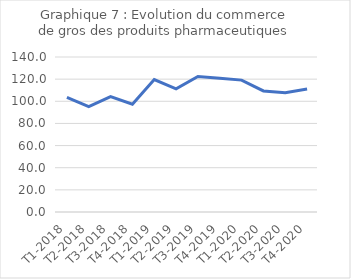
| Category | Series 0 |
|---|---|
| T1-2018 | 103.426 |
| T2-2018 | 95.112 |
| T3-2018 | 104.207 |
| T4-2018 | 97.33 |
| T1-2019 | 119.664 |
| T2-2019 | 111.175 |
| T3-2019 | 122.349 |
| T4-2019 | 120.712 |
| T1-2020 | 119.125 |
| T2-2020 | 109.355 |
| T3-2020 | 107.746 |
| T4-2020 | 111.033 |